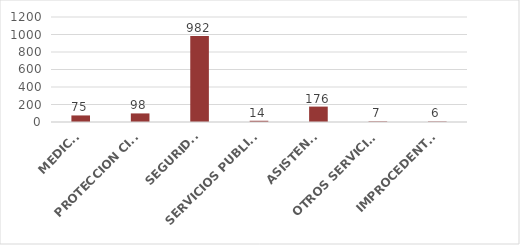
| Category | TOTAL |
|---|---|
| MEDICO | 75 |
| PROTECCION CIVIL | 98 |
| SEGURIDAD | 982 |
| SERVICIOS PUBLICOS | 14 |
| ASISTENCIA | 176 |
| OTROS SERVICIOS | 7 |
| IMPROCEDENTES | 6 |